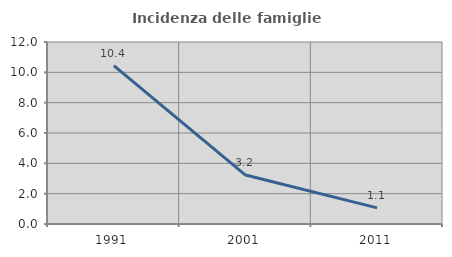
| Category | Incidenza delle famiglie numerose |
|---|---|
| 1991.0 | 10.448 |
| 2001.0 | 3.226 |
| 2011.0 | 1.062 |